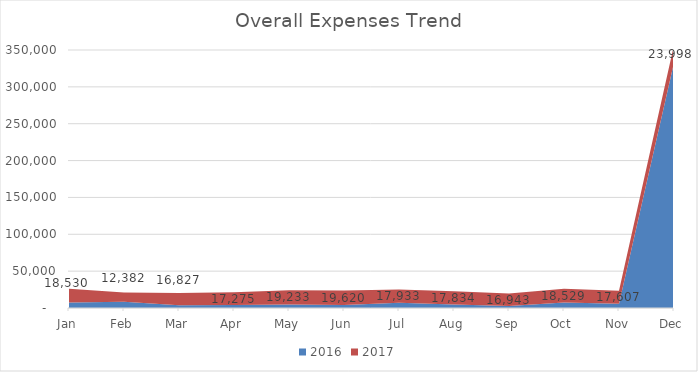
| Category | 2016 | 2017 |
|---|---|---|
| Jan | 7628 | 18530.06 |
| Feb | 8481.01 | 12382.24 |
| Mar | 3656.53 | 16826.87 |
| Apr | 4030.06 | 17275.1 |
| May | 4855.84 | 19233.41 |
| Jun | 4045.79 | 19619.95 |
| Jul | 7159.43 | 17933.42 |
| Aug | 4901.66 | 17833.99 |
| Sep | 2829.54 | 16943.28 |
| Oct | 7518.39 | 18528.76 |
| Nov | 5651.25 | 17607.42 |
| Dec | 332826.7 | 23998 |